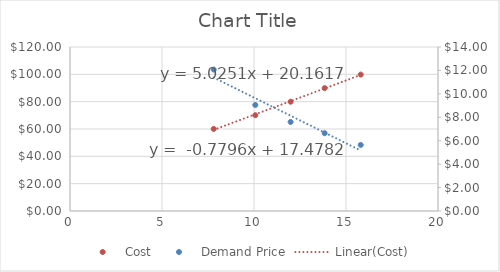
| Category | Cost |
|---|---|
| 7.81 | 60.05 |
| 10.07 | 70.09 |
| 11.99 | 79.98 |
| 13.84 | 89.9 |
| 15.8 | 99.83 |